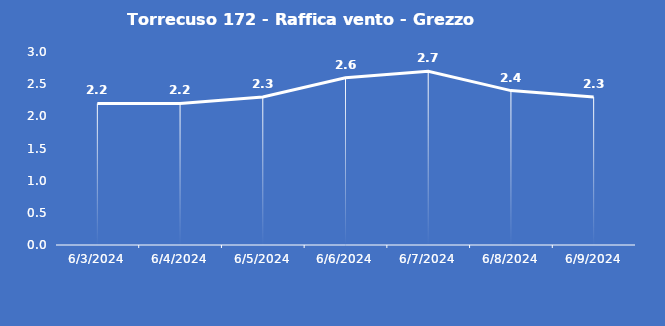
| Category | Torrecuso 172 - Raffica vento - Grezzo (m/s) |
|---|---|
| 6/3/24 | 2.2 |
| 6/4/24 | 2.2 |
| 6/5/24 | 2.3 |
| 6/6/24 | 2.6 |
| 6/7/24 | 2.7 |
| 6/8/24 | 2.4 |
| 6/9/24 | 2.3 |